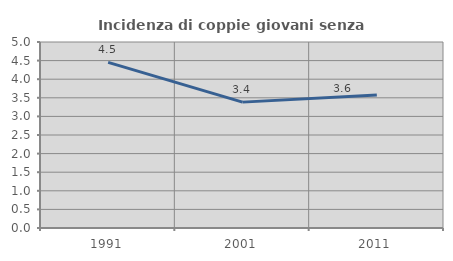
| Category | Incidenza di coppie giovani senza figli |
|---|---|
| 1991.0 | 4.451 |
| 2001.0 | 3.384 |
| 2011.0 | 3.573 |